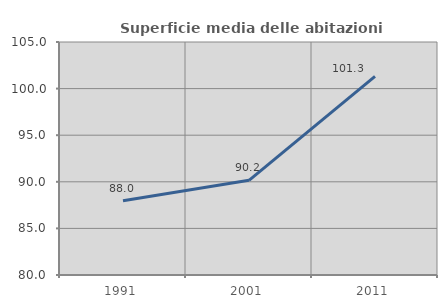
| Category | Superficie media delle abitazioni occupate |
|---|---|
| 1991.0 | 87.97 |
| 2001.0 | 90.159 |
| 2011.0 | 101.311 |